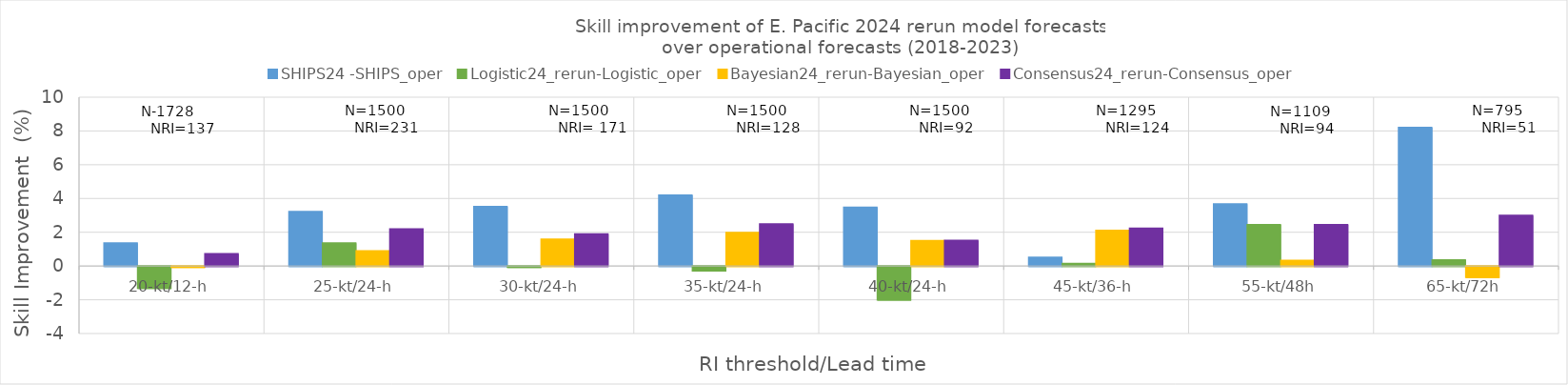
| Category | SHIPS24 -SHIPS_oper | Logistic24_rerun-Logistic_oper | Bayesian24_rerun-Bayesian_oper | Consensus24_rerun-Consensus_oper |
|---|---|---|---|---|
| 20-kt/12-h | 1.35 | -1.3 | -0.06 | 0.71 |
| 25-kt/24-h | 3.21 | 1.35 | 0.89 | 2.18 |
| 30-kt/24-h | 3.51 | -0.06 | 1.57 | 1.89 |
| 35-kt/24-h | 4.19 | -0.27 | 1.97 | 2.48 |
| 40-kt/24-h | 3.46 | -2 | 1.49 | 1.51 |
| 45-kt/36-h | 0.5 | 0.13 | 2.09 | 2.22 |
| 55-kt/48h | 3.67 | 2.44 | 0.32 | 2.44 |
| 65-kt/72h | 8.2 | 0.34 | -0.66 | 2.99 |